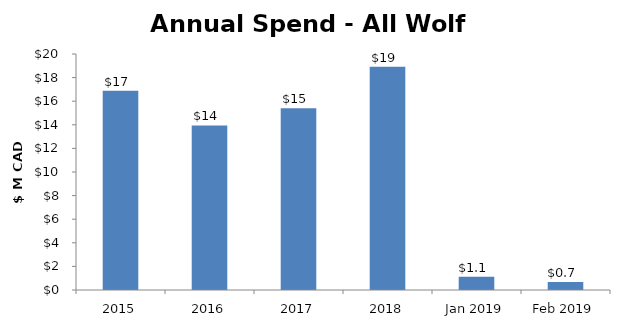
| Category | Total |
|---|---|
| 2015 | 16891071 |
| 2016 | 13945417 |
| 2017 | 15412442.75 |
| 2018 | 18910031 |
| Jan 2019 | 1131342.73 |
| Feb 2019 | 677989 |